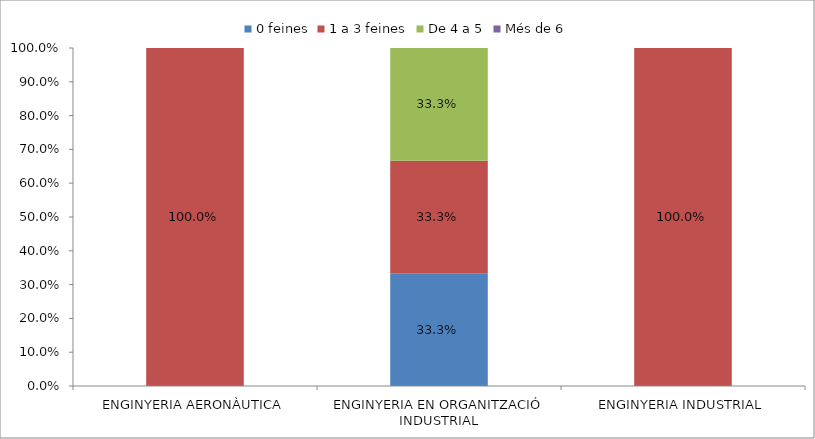
| Category | 0 feines | 1 a 3 feines | De 4 a 5 | Més de 6 |
|---|---|---|---|---|
| ENGINYERIA AERONÀUTICA | 0 | 1 | 0 | 0 |
| ENGINYERIA EN ORGANITZACIÓ INDUSTRIAL | 0.333 | 0.333 | 0.333 | 0 |
| ENGINYERIA INDUSTRIAL | 0 | 1 | 0 | 0 |